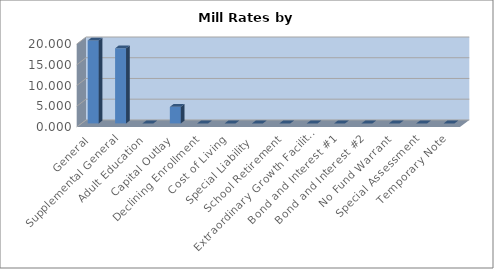
| Category | 2018-2019 |
|---|---|
| General | 20 |
| Supplemental General | 18.121 |
| Adult Education | 0 |
| Capital Outlay | 4 |
| Declining Enrollment | 0 |
| Cost of Living | 0 |
| Special Liability  | 0 |
| School Retirement | 0 |
| Extraordinary Growth Facilities | 0 |
| Bond and Interest #1 | 0 |
| Bond and Interest #2 | 0 |
| No Fund Warrant | 0 |
| Special Assessment | 0 |
| Temporary Note | 0 |